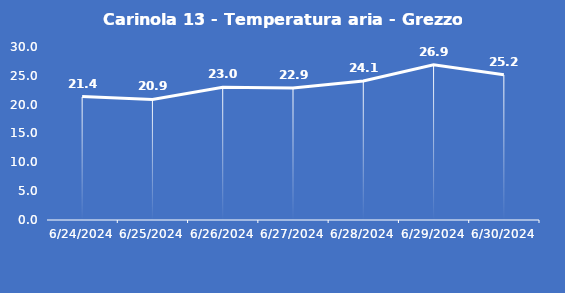
| Category | Carinola 13 - Temperatura aria - Grezzo (°C) |
|---|---|
| 6/24/24 | 21.4 |
| 6/25/24 | 20.9 |
| 6/26/24 | 23 |
| 6/27/24 | 22.9 |
| 6/28/24 | 24.1 |
| 6/29/24 | 26.9 |
| 6/30/24 | 25.2 |